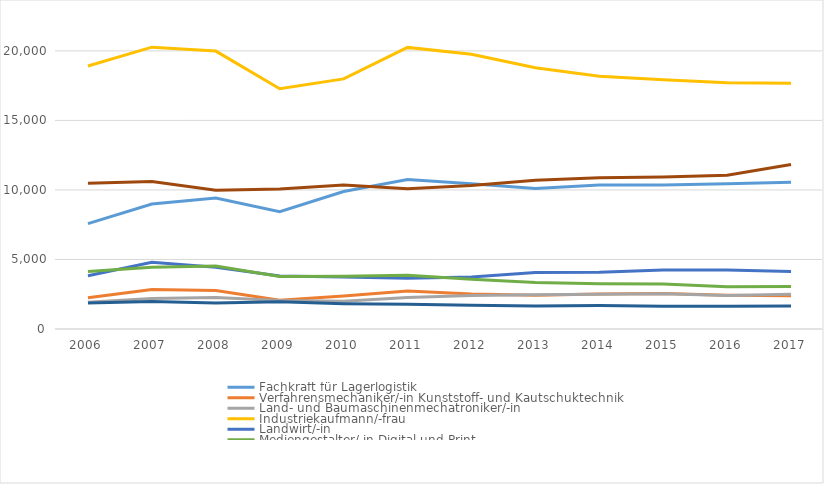
| Category | Fachkraft für Lagerlogistik | Verfahrensmechaniker/-in Kunststoff- und Kautschuktechnik | Land- und Baumaschinenmechatroniker/-in | Industriekaufmann/-frau | Landwirt/-in | Mediengestalter/-in Digital und Print | Straßenbauer/-in | Anlagenmechaniker/-in für Sanitär-, Heizungs- und Klimatechnik  |
|---|---|---|---|---|---|---|---|---|
| 2006.0 | 7581 | 2244 | 1923 | 18918 | 3831 | 4143 | 1875 | 10488 |
| 2007.0 | 8991 | 2838 | 2202 | 20268 | 4803 | 4446 | 1977 | 10614 |
| 2008.0 | 9423 | 2766 | 2274 | 19986 | 4434 | 4530 | 1869 | 9981 |
| 2009.0 | 8442 | 2073 | 2055 | 17280 | 3813 | 3783 | 1956 | 10068 |
| 2010.0 | 9885 | 2376 | 2004 | 17985 | 3741 | 3801 | 1821 | 10362 |
| 2011.0 | 10749 | 2739 | 2274 | 20253 | 3642 | 3864 | 1773 | 10092 |
| 2012.0 | 10446 | 2526 | 2406 | 19764 | 3735 | 3582 | 1707 | 10323 |
| 2013.0 | 10110 | 2425 | 2469 | 18789 | 4065 | 3336 | 1650 | 10704 |
| 2014.0 | 10356 | 2523 | 2499 | 18177 | 4074 | 3246 | 1683 | 10878 |
| 2015.0 | 10356 | 2556 | 2541 | 17922 | 4239 | 3228 | 1644 | 10926 |
| 2016.0 | 10455 | 2433 | 2406 | 17703 | 4242 | 3045 | 1632 | 11061 |
| 2017.0 | 10560 | 2394 | 2502 | 17673 | 4143 | 3063 | 1650 | 11823 |